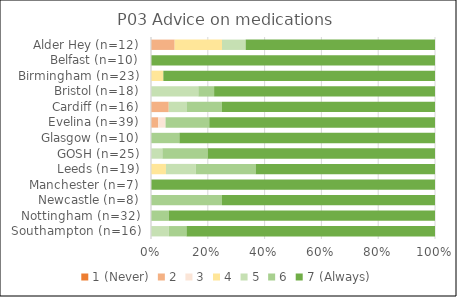
| Category | 1 (Never) | 2 | 3 | 4 | 5 | 6 | 7 (Always) |
|---|---|---|---|---|---|---|---|
| Southampton (n=16) | 0 | 0 | 0 | 0 | 1 | 1 | 14 |
| Nottingham (n=32) | 0 | 0 | 0 | 0 | 0 | 2 | 30 |
| Newcastle (n=8) | 0 | 0 | 0 | 0 | 0 | 2 | 6 |
| Manchester (n=7) | 0 | 0 | 0 | 0 | 0 | 0 | 7 |
| Leeds (n=19) | 0 | 0 | 0 | 1 | 2 | 4 | 12 |
| GOSH (n=25) | 0 | 0 | 0 | 0 | 1 | 4 | 20 |
| Glasgow (n=10) | 0 | 0 | 0 | 0 | 0 | 1 | 9 |
| Evelina (n=39) | 0 | 1 | 1 | 0 | 0 | 6 | 31 |
| Cardiff (n=16) | 0 | 1 | 0 | 0 | 1 | 2 | 12 |
| Bristol (n=18) | 0 | 0 | 0 | 0 | 3 | 1 | 14 |
| Birmingham (n=23) | 0 | 0 | 0 | 1 | 0 | 0 | 22 |
| Belfast (n=10) | 0 | 0 | 0 | 0 | 0 | 0 | 10 |
| Alder Hey (n=12) | 0 | 1 | 0 | 2 | 1 | 0 | 8 |